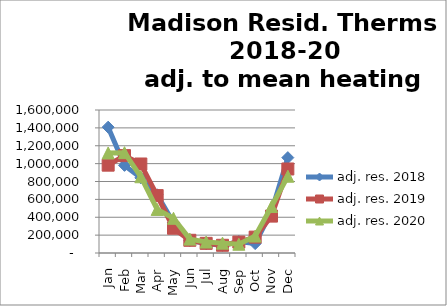
| Category | adj. res. 2018 | adj. res. 2019 | adj. res. 2020 |
|---|---|---|---|
| Jan | 1408085.745 | 982776.217 | 1119555.195 |
| Feb | 980277.798 | 1089682.112 | 1122758.546 |
| Mar | 840639.251 | 995884.142 | 853291.737 |
| Apr | 651194.112 | 642301.27 | 487410.499 |
| May | 337680.279 | 276773.144 | 388368.572 |
| Jun | 140611.708 | 142201.139 | 155404.109 |
| Jul | 104915 | 107882 | 122727.318 |
| Aug | 85617 | 86271 | 110455.199 |
| Sep | 128658.891 | 122329.723 | 97862.858 |
| Oct | 104965.653 | 177504.357 | 189267.261 |
| Nov | 463447.865 | 412763.528 | 520317.97 |
| Dec | 1067093.486 | 940200.489 | 859080.784 |